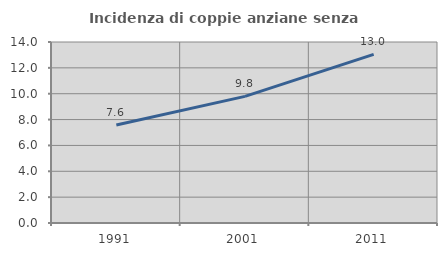
| Category | Incidenza di coppie anziane senza figli  |
|---|---|
| 1991.0 | 7.578 |
| 2001.0 | 9.794 |
| 2011.0 | 13.041 |